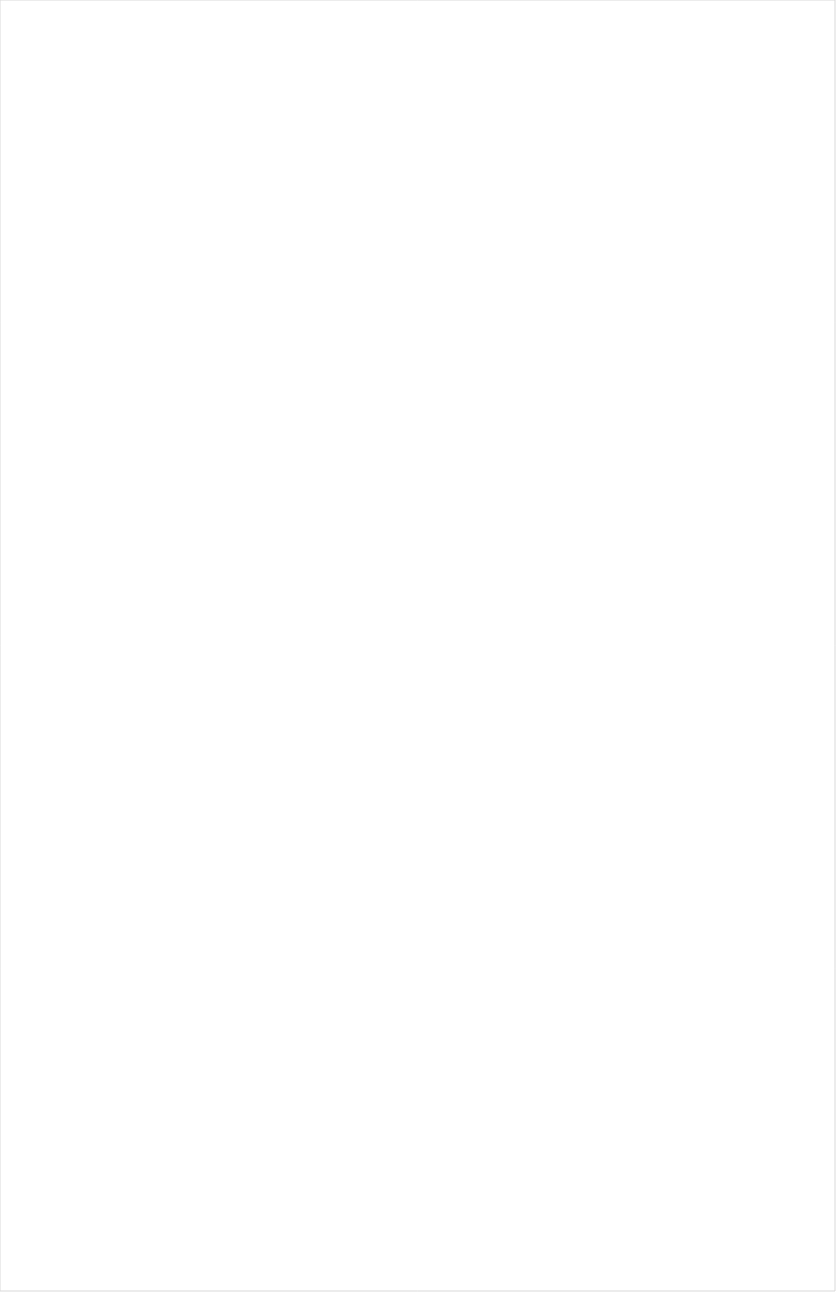
| Category | Total |
|---|---|
| Cartoon Network | -0.21 |
| Nick Toons | -0.209 |
| Nick | -0.204 |
| VH1 | -0.198 |
| MTV2 | -0.194 |
| Nick Jr. | -0.194 |
| Teen Nick | -0.193 |
| Disney Channel | -0.191 |
| Disney Junior US | -0.182 |
| Telemundo | -0.174 |
| Univision | -0.173 |
| UniMas | -0.17 |
| Adult Swim | -0.17 |
| MTV | -0.16 |
| Disney XD | -0.15 |
| Nick@Nite | -0.148 |
| TUDN | -0.146 |
| NBC Universo | -0.145 |
| Galavision | -0.144 |
| truTV | -0.144 |
| ESPN Deportes | -0.139 |
| Universal Kids | -0.124 |
| BET | -0.124 |
| TV ONE | -0.121 |
| Comedy Central | -0.113 |
| FXX | -0.112 |
| FX | -0.107 |
| ESPN | -0.107 |
| ESPN2 | -0.103 |
| BET Her | -0.102 |
| ESPNEWS | -0.096 |
| E! | -0.094 |
| NBA TV | -0.089 |
| Freeform | -0.079 |
| TNT | -0.074 |
| USA Network | -0.066 |
| BRAVO | -0.065 |
| FXDEP | -0.062 |
| Viceland | -0.052 |
| SYFY | -0.051 |
| NFL Network | -0.047 |
| TBS | -0.04 |
| FX Movie Channel | -0.037 |
| A&E | -0.037 |
| Fox Sports 1 | -0.035 |
| Lifetime | -0.035 |
| Lifetime Movies | -0.033 |
| MLB Network | -0.031 |
| Paramount Network | -0.03 |
| TLC | -0.029 |
| ESPNU | -0.028 |
| Cooking Channel | -0.021 |
| Independent Film (IFC) | -0.021 |
| WE TV | -0.019 |
| Discovery Life Channel | -0.016 |
| Travel | -0.015 |
| NHL | -0.011 |
| Food Network | -0.01 |
| CW | -0.009 |
| Discovery Family Channel | -0.009 |
| AMC | -0.009 |
| Discovery Channel | -0.008 |
| CNBC | -0.001 |
| National Geographic | 0.002 |
| FOX Sports 2 | 0.003 |
| Oprah Winfrey Network | 0.004 |
| FOX | 0.006 |
| Investigation Discovery | 0.006 |
| The Sportsman Channel | 0.007 |
| POP | 0.009 |
| OXYGEN | 0.011 |
| Destination America | 0.016 |
| MyNetworkTV | 0.017 |
| Logo | 0.018 |
| Motor Trend Network | 0.02 |
| CMTV | 0.022 |
| BBC America | 0.027 |
| FYI | 0.031 |
| Ovation | 0.033 |
| Big Ten Network | 0.039 |
| Headline News | 0.044 |
| NBC Sports | 0.044 |
| Animal Planet | 0.044 |
| Reelz Channel | 0.045 |
| UP TV | 0.045 |
| ABC | 0.052 |
| Olympic Channel | 0.054 |
| Game Show | 0.056 |
| Golf | 0.058 |
| HGTV | 0.061 |
| DIY | 0.061 |
| History Channel | 0.071 |
| ION | 0.073 |
| TV LAND | 0.075 |
| American Heroes Channel | 0.076 |
| CBS Sports | 0.078 |
| NBC | 0.078 |
| Great American Country | 0.078 |
| SundanceTV | 0.081 |
| CNN | 0.081 |
| PAC-12 Network | 0.084 |
| Science Channel | 0.084 |
| National Geographic Wild | 0.088 |
| Bloomberg HD | 0.089 |
| WGN America | 0.096 |
| Outdoor Channel | 0.109 |
| Weather Channel | 0.116 |
| CBS | 0.12 |
| Tennis Channel | 0.142 |
| Hallmark | 0.152 |
| Fox News | 0.156 |
| Smithsonian | 0.165 |
| MSNBC | 0.205 |
| INSP | 0.22 |
| PBS | 0.252 |
| Fox Business | 0.254 |
| Hallmark Movies & Mysteries | 0.255 |
| RFD TV | 0.285 |